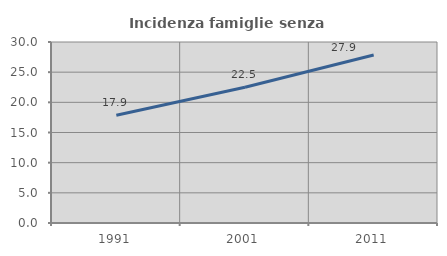
| Category | Incidenza famiglie senza nuclei |
|---|---|
| 1991.0 | 17.874 |
| 2001.0 | 22.511 |
| 2011.0 | 27.857 |